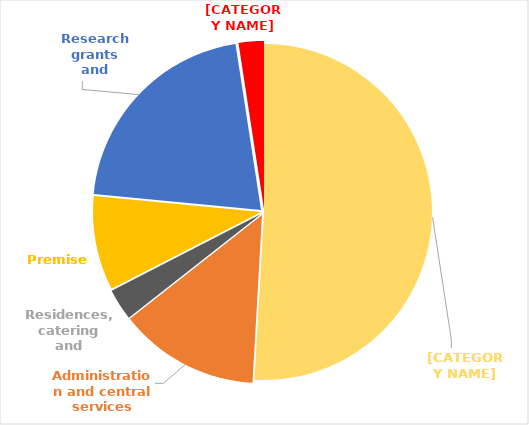
| Category | Series 0 |
|---|---|
| Academic and related expenditure | 200044 |
| Administration and central services | 53074 |
| Residences, catering and conferences | 11939 |
| Premises | 35662 |
| Research grants and contracts | 82761 |
| Other expenses | 9539 |